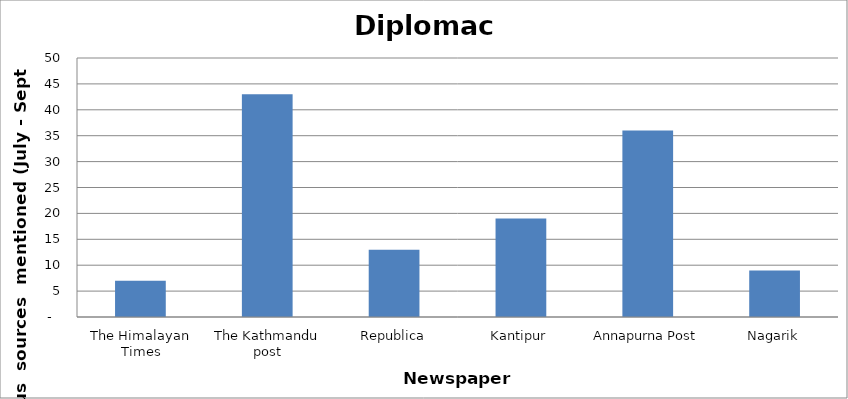
| Category | Diplomacy |
|---|---|
| The Himalayan Times | 7 |
| The Kathmandu post | 43 |
| Republica | 13 |
| Kantipur | 19 |
| Annapurna Post | 36 |
| Nagarik | 9 |